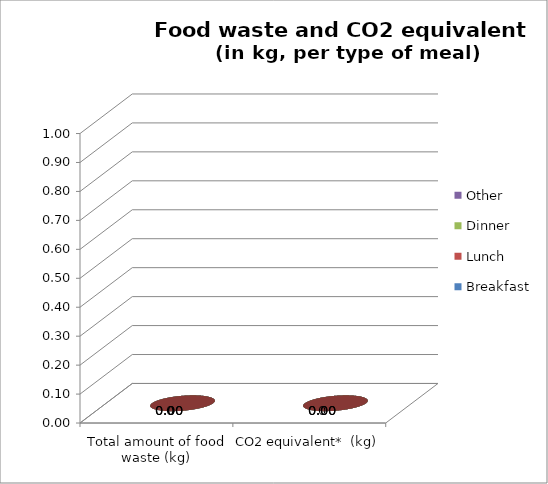
| Category | Breakfast | Lunch | Dinner | Other |
|---|---|---|---|---|
| Total amount of food waste (kg) | 0 | 0 | 0 | 0 |
| CO2 equivalent*  (kg) | 0 | 0 | 0 | 0 |